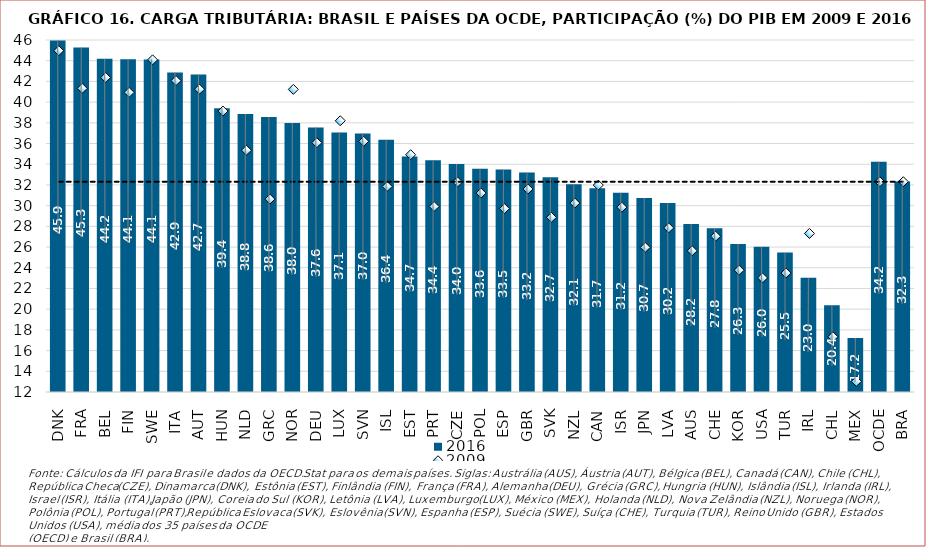
| Category | 2016 |
|---|---|
| DNK | 45.942 |
| FRA | 45.272 |
| BEL | 44.179 |
| FIN | 44.131 |
| SWE | 44.12 |
| ITA | 42.866 |
| AUT | 42.675 |
| HUN | 39.41 |
| NLD | 38.849 |
| GRC | 38.56 |
| NOR | 37.984 |
| DEU | 37.555 |
| LUX | 37.072 |
| SVN | 36.979 |
| ISL | 36.371 |
| EST | 34.739 |
| PRT | 34.38 |
| CZE | 34.031 |
| POL | 33.563 |
| ESP | 33.483 |
| GBR | 33.21 |
| SVK | 32.735 |
| NZL | 32.075 |
| CAN | 31.675 |
| ISR | 31.245 |
| JPN | 30.743 |
| LVA | 30.246 |
| AUS | 28.224 |
| CHE | 27.826 |
| KOR | 26.307 |
| USA | 26.021 |
| TUR | 25.465 |
| IRL | 23.031 |
| CHL | 20.391 |
| MEX | 17.216 |
| OCDE | 34.245 |
| BRA | 32.337 |